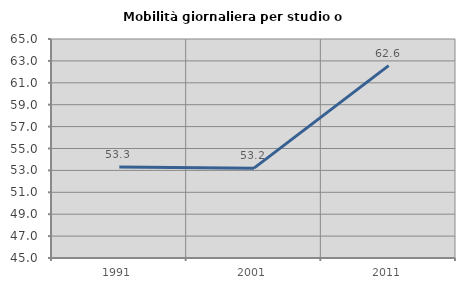
| Category | Mobilità giornaliera per studio o lavoro |
|---|---|
| 1991.0 | 53.318 |
| 2001.0 | 53.207 |
| 2011.0 | 62.57 |